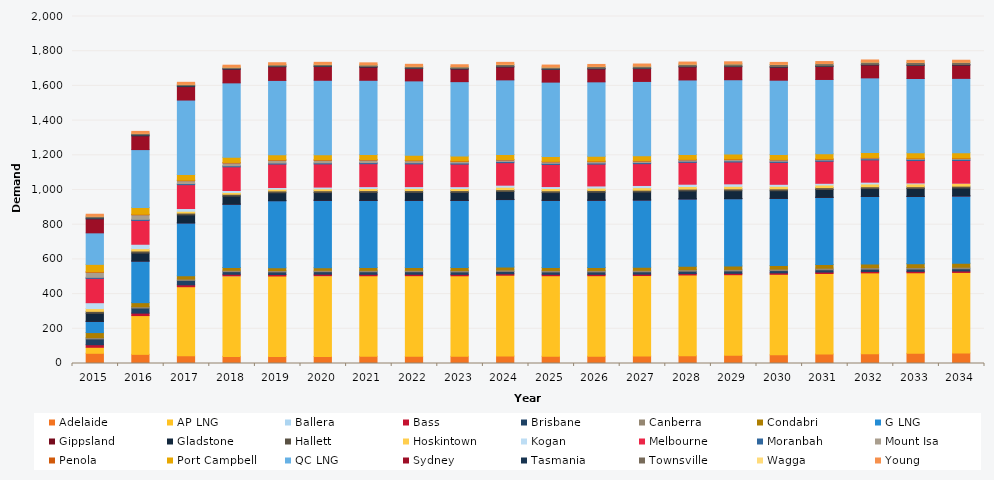
| Category | Adelaide | AP LNG | Ballera | Bass | Brisbane | Canberra | Condabri | G LNG | Gippsland | Gladstone | Hallett | Hoskintown | Kogan | Melbourne | Moranbah | Mount Isa | Penola | Port Campbell | QC LNG | Sydney | Tasmania | Townsville | Wagga | Young |
|---|---|---|---|---|---|---|---|---|---|---|---|---|---|---|---|---|---|---|---|---|---|---|---|---|
| 2015.0 | 58.84 | 34.57 | 0 | 14.805 | 33.591 | 7.631 | 28.718 | 64.65 | 0.407 | 46.164 | 11.21 | 15.866 | 33.967 | 140.058 | 6.137 | 28.959 | 3.174 | 42.684 | 181.643 | 80.734 | 5.529 | 9.918 | 0.019 | 11.006 |
| 2016.0 | 52.747 | 223.457 | 0 | 14.095 | 29.508 | 7.701 | 23.227 | 239.807 | 0.359 | 45.837 | 11.798 | 13.416 | 25.363 | 137.18 | 6.325 | 26.204 | 3.19 | 38.312 | 334.383 | 79.592 | 5.46 | 8.935 | 0.004 | 10.891 |
| 2017.0 | 44.214 | 398.305 | 0 | 10.808 | 25.788 | 7.858 | 18.247 | 305.315 | 0.355 | 45.673 | 10.554 | 10.472 | 15.877 | 137.314 | 6.309 | 16.315 | 3.226 | 33.335 | 428.478 | 77.492 | 5.385 | 8.36 | 0.022 | 10.962 |
| 2018.0 | 41.066 | 464.383 | 0 | 8.757 | 15.307 | 7.981 | 15.938 | 364.984 | 0.486 | 46.04 | 10.557 | 10.309 | 11.249 | 136.409 | 6.294 | 15.779 | 3.243 | 30.244 | 428.478 | 78.792 | 3.758 | 8.202 | 0.067 | 11.029 |
| 2019.0 | 40.039 | 464.383 | 0 | 8.525 | 15.024 | 8.061 | 15.171 | 387.217 | 0.478 | 45.396 | 10.389 | 10.496 | 9.214 | 134.872 | 6.279 | 15.681 | 3.235 | 28.629 | 428.478 | 78.878 | 3.775 | 8.03 | 0.267 | 11.021 |
| 2020.0 | 40.611 | 465.655 | 0 | 8.391 | 14.686 | 8.11 | 14.769 | 388.278 | 0.548 | 44.237 | 10.419 | 11.069 | 10.094 | 133.268 | 6.427 | 14.7 | 3.23 | 28.262 | 429.652 | 79.645 | 3.796 | 8.617 | 0.4 | 10.957 |
| 2021.0 | 41.427 | 464.383 | 0 | 8.273 | 14.747 | 8.168 | 15.946 | 387.217 | 0.658 | 45.446 | 10.372 | 11.969 | 10.829 | 131.975 | 6.568 | 14.22 | 3.238 | 28.473 | 428.478 | 75.846 | 3.788 | 9.552 | 0.44 | 10.892 |
| 2022.0 | 41.825 | 464.383 | 0 | 8.205 | 14.593 | 8.219 | 15.936 | 387.217 | 0.669 | 45.428 | 10.384 | 12.113 | 10.58 | 130.842 | 6.701 | 11.763 | 3.236 | 28.37 | 428.478 | 70.957 | 3.774 | 9.616 | 0.324 | 10.817 |
| 2023.0 | 41.246 | 464.383 | 0 | 8.133 | 14.277 | 8.29 | 16.571 | 387.217 | 0.71 | 45.406 | 10.335 | 11.806 | 10.859 | 129.852 | 6.686 | 8.553 | 3.237 | 28.446 | 428.478 | 72.778 | 3.78 | 9.413 | 0.699 | 10.809 |
| 2024.0 | 43.251 | 465.655 | 0 | 8.063 | 14.108 | 8.379 | 17.104 | 388.278 | 1.17 | 45.399 | 10.414 | 14.197 | 11.835 | 129.644 | 6.671 | 8.354 | 3.273 | 29.287 | 429.652 | 74.702 | 3.749 | 10.091 | 1.514 | 10.83 |
| 2025.0 | 41.607 | 464.383 | 0 | 7.997 | 13.789 | 8.464 | 16.754 | 387.217 | 0.751 | 44.186 | 10.349 | 13.004 | 11.36 | 127.148 | 6.656 | 8.15 | 3.223 | 28.313 | 428.478 | 73.039 | 3.738 | 10.091 | 0.551 | 10.85 |
| 2026.0 | 41.772 | 464.383 | 0 | 7.954 | 13.888 | 8.545 | 17.19 | 387.217 | 0.807 | 45.391 | 10.341 | 13.488 | 12.388 | 125.739 | 6.642 | 7.958 | 3.219 | 27.989 | 428.478 | 74.64 | 3.593 | 10.482 | 0.715 | 10.872 |
| 2027.0 | 42.619 | 464.383 | 0 | 7.944 | 13.722 | 8.624 | 17.866 | 387.217 | 0.779 | 45.397 | 10.345 | 14.413 | 12.803 | 125.56 | 6.627 | 7.765 | 3.231 | 27.946 | 428.478 | 73.943 | 3.478 | 11.367 | 0.744 | 10.89 |
| 2028.0 | 44.697 | 465.655 | 0 | 7.964 | 13.88 | 8.725 | 19.302 | 388.278 | 0.929 | 45.404 | 10.37 | 14.945 | 13.258 | 125.671 | 6.612 | 7.572 | 3.253 | 28.141 | 429.652 | 75.504 | 3.45 | 12.122 | 1.12 | 10.934 |
| 2029.0 | 47.394 | 464.383 | 0 | 7.984 | 13.901 | 8.824 | 20.064 | 387.217 | 1.045 | 45.076 | 10.413 | 14.952 | 14.234 | 125.883 | 6.598 | 7.375 | 3.277 | 28.352 | 428.478 | 75.584 | 3.443 | 12.415 | 1.043 | 10.966 |
| 2030.0 | 49.737 | 464.383 | 0 | 8.015 | 13.446 | 8.921 | 19.857 | 387.217 | 0.915 | 43.528 | 10.418 | 14.967 | 11.444 | 126.085 | 6.583 | 7.164 | 3.287 | 28.442 | 428.478 | 74.961 | 3.397 | 12.313 | 0.858 | 11 |
| 2031.0 | 54.466 | 464.383 | 0 | 8.063 | 13.563 | 8.989 | 20.671 | 387.217 | 0.978 | 44.708 | 10.422 | 15.434 | 9.725 | 126.989 | 6.569 | 4.37 | 3.293 | 28.77 | 428.478 | 75.138 | 3.379 | 12.921 | 0.805 | 10.995 |
| 2032.0 | 56.785 | 465.655 | 0 | 8.123 | 13.295 | 9.041 | 21.293 | 388.278 | 1.084 | 44.706 | 10.449 | 16.104 | 10.381 | 128.183 | 6.555 | 4.374 | 3.316 | 29.046 | 429.652 | 74.445 | 3.361 | 13.356 | 0.961 | 10.967 |
| 2033.0 | 58.569 | 464.383 | 0 | 8.183 | 13.152 | 9.092 | 21.886 | 387.217 | 1.312 | 44.683 | 10.47 | 16.377 | 5.377 | 128.995 | 6.54 | 4.363 | 3.35 | 30.121 | 428.478 | 75.623 | 3.342 | 13.774 | 0.693 | 10.944 |
| 2034.0 | 60.435 | 464.383 | 0 | 8.236 | 13.019 | 9.143 | 22.729 | 387.217 | 1.852 | 44.656 | 10.558 | 16.84 | 0.199 | 130.828 | 6.54 | 4.349 | 3.408 | 30.45 | 428.478 | 76.51 | 3.321 | 13.698 | 0.137 | 10.92 |